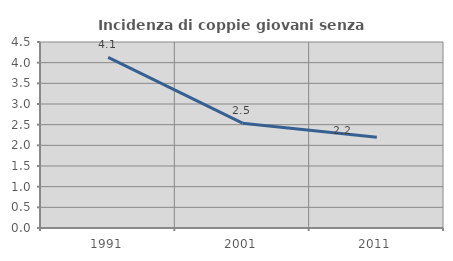
| Category | Incidenza di coppie giovani senza figli |
|---|---|
| 1991.0 | 4.126 |
| 2001.0 | 2.536 |
| 2011.0 | 2.196 |